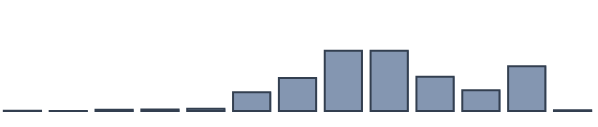
| Category | Series 0 |
|---|---|
| 0 | 0.111 |
| 1 | 0.033 |
| 2 | 0.409 |
| 3 | 0.503 |
| 4 | 0.803 |
| 5 | 6.74 |
| 6 | 11.859 |
| 7 | 21.682 |
| 8 | 21.714 |
| 9 | 12.364 |
| 10 | 7.46 |
| 11 | 16.093 |
| 12 | 0.229 |